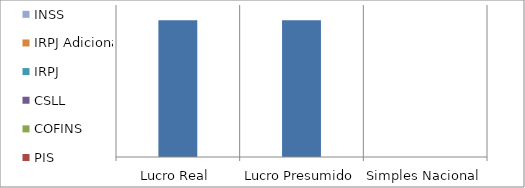
| Category | ISSQN | PIS | COFINS | CSLL | IRPJ | IRPJ Adicional | INSS |
|---|---|---|---|---|---|---|---|
| Lucro Real | 360 | 0 | 0 | 0 | 0 | 0 | 0 |
| Lucro Presumido | 360 | 0 | 0 | 0 | 0 | 0 | 0 |
| Simples Nacional | 0 | 0 | 0 | 0 | 0 | 0 | 0 |